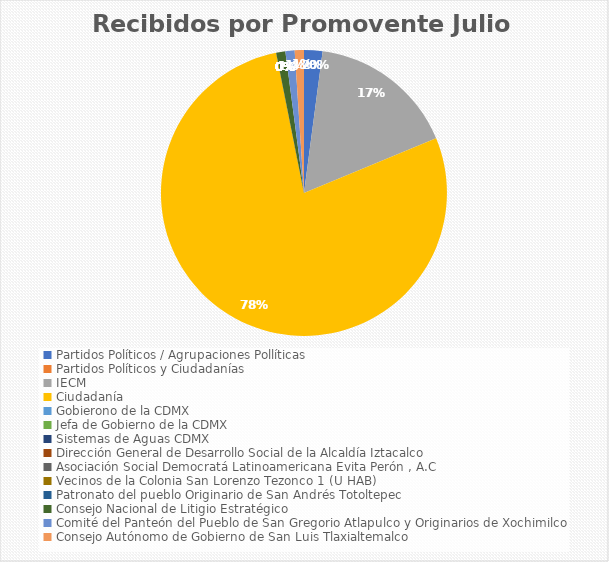
| Category | Recibidos por Promovente Julio |
|---|---|
| Partidos Políticos / Agrupaciones Pollíticas | 2 |
| Partidos Políticos y Ciudadanías | 0 |
| IECM | 16 |
| Ciudadanía  | 75 |
| Gobierono de la CDMX | 0 |
| Jefa de Gobierno de la CDMX | 0 |
| Sistemas de Aguas CDMX | 0 |
| Dirección General de Desarrollo Social de la Alcaldía Iztacalco | 0 |
| Asociación Social Democratá Latinoamericana Evita Perón , A.C | 0 |
| Vecinos de la Colonia San Lorenzo Tezonco 1 (U HAB) | 0 |
| Patronato del pueblo Originario de San Andrés Totoltepec | 0 |
| Consejo Nacional de Litigio Estratégico | 1 |
| Comité del Panteón del Pueblo de San Gregorio Atlapulco y Originarios de Xochimilco | 1 |
| Consejo Autónomo de Gobierno de San Luis Tlaxialtemalco | 1 |